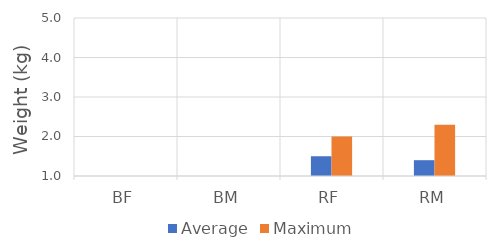
| Category | Average | Maximum |
|---|---|---|
| BF | 0 | 0 |
| BM | 0 | 0 |
| RF | 1.5 | 2 |
| RM | 1.4 | 2.3 |